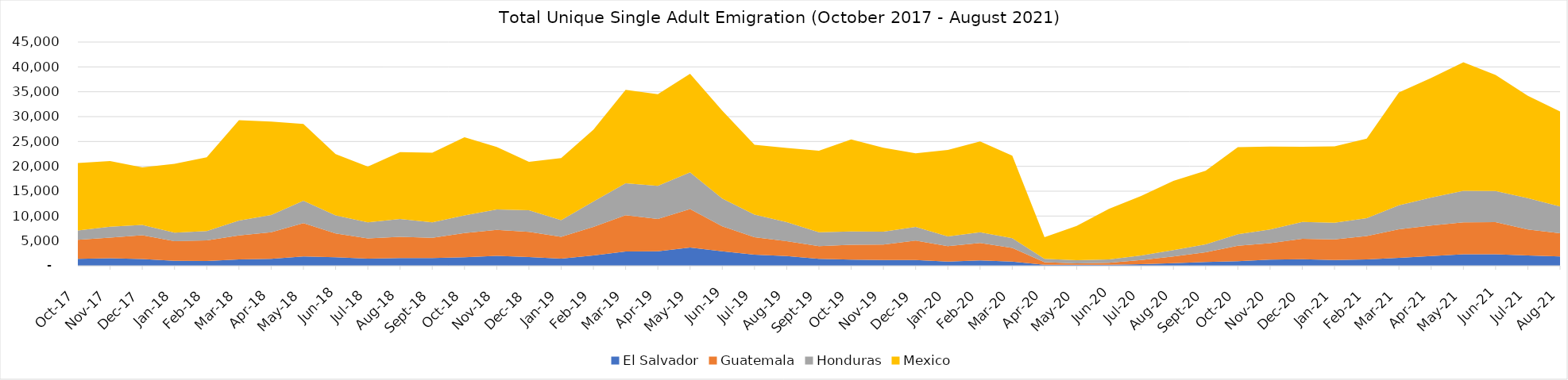
| Category | El Salvador | Guatemala | Honduras | Mexico |
|---|---|---|---|---|
| 2017-10-01 | 1392 | 3819.077 | 1904 | 13559.335 |
| 2017-11-01 | 1502.769 | 4173.538 | 2173.538 | 13203.52 |
| 2017-12-01 | 1371.077 | 4790.154 | 2036.923 | 11603.526 |
| 2018-01-01 | 1001.846 | 3944.615 | 1729.231 | 13831.508 |
| 2018-02-01 | 941.538 | 4150.154 | 1886.769 | 14859.138 |
| 2018-03-01 | 1288.615 | 4812.308 | 3010.462 | 20164.486 |
| 2018-04-01 | 1405.538 | 5328 | 3492.923 | 18768.222 |
| 2018-05-01 | 1860.923 | 6721.231 | 4508.308 | 15426.978 |
| 2018-06-01 | 1697.231 | 4823.385 | 3617.231 | 12341.815 |
| 2018-07-01 | 1438.769 | 4072.615 | 3244.308 | 11202.978 |
| 2018-08-01 | 1564.308 | 4258.462 | 3576.615 | 13452.997 |
| 2018-09-01 | 1568 | 4050.462 | 3133.538 | 14001.034 |
| 2018-10-01 | 1731.692 | 4835.692 | 3580.308 | 15710.954 |
| 2018-11-01 | 1975.385 | 5228.308 | 4129.231 | 12569.692 |
| 2018-12-01 | 1740.308 | 5079.385 | 4344.615 | 9725.969 |
| 2019-01-01 | 1421.538 | 4396.308 | 3362.462 | 12467.157 |
| 2019-02-01 | 2075.077 | 5747.692 | 5121.231 | 14403.852 |
| 2019-03-01 | 2889.846 | 7264 | 6459.077 | 18764.511 |
| 2019-04-01 | 2894.769 | 6535.385 | 6658.462 | 18436.905 |
| 2019-05-01 | 3660.308 | 7734.154 | 7382.154 | 19835.071 |
| 2019-06-01 | 2896 | 5038.769 | 5601.231 | 17656.394 |
| 2019-07-01 | 2248.615 | 3502.769 | 4532.923 | 14048.135 |
| 2019-08-01 | 1936 | 3005.538 | 3826.462 | 14938.308 |
| 2019-09-01 | 1394.462 | 2560 | 2782.769 | 16412.018 |
| 2019-10-01 | 1255.385 | 2984.615 | 2643.692 | 18548.203 |
| 2019-11-01 | 1170.462 | 3101.538 | 2609.231 | 16858.775 |
| 2019-12-01 | 1163.077 | 3917.538 | 2740.923 | 14786.086 |
| 2020-01-01 | 843.077 | 3100.308 | 1958.154 | 17414.431 |
| 2020-02-01 | 1075.692 | 3513.846 | 2172.308 | 18270.738 |
| 2020-03-01 | 840.077 | 2736.769 | 1969.308 | 16582.561 |
| 2020-04-01 | 209.308 | 497.308 | 687.615 | 4352.272 |
| 2020-05-01 | 182.385 | 281.154 | 646.769 | 6916.01 |
| 2020-06-01 | 201.308 | 379.231 | 705 | 10150.035 |
| 2020-07-01 | 327.462 | 832.077 | 926.231 | 11946.818 |
| 2020-08-01 | 512 | 1360.923 | 1298.154 | 13897.566 |
| 2020-09-01 | 745.231 | 1967.615 | 1594.231 | 14806.473 |
| 2020-10-01 | 932.154 | 3107 | 2296.462 | 17532.403 |
| 2020-11-01 | 1219.154 | 3322.077 | 2743.231 | 16691.236 |
| 2020-12-01 | 1304.769 | 4122 | 3387.154 | 15103.124 |
| 2021-01-01 | 1141.769 | 4149.462 | 3365.846 | 15345.737 |
| 2021-02-01 | 1260 | 4721.538 | 3575.923 | 16010.428 |
| 2021-03-01 | 1592.154 | 5745.769 | 4823 | 22690.758 |
| 2021-04-01 | 1973 | 6117.154 | 5649.846 | 24052.606 |
| 2021-05-01 | 2312 | 6430.154 | 6340.923 | 25847.072 |
| 2021-06-01 | 2324.462 | 6468.462 | 6261 | 23328.381 |
| 2021-07-01 | 2073.385 | 5222 | 6300 | 20603.059 |
| 2021-08-01 | 1888.923 | 4634.769 | 5387.077 | 19138.963 |